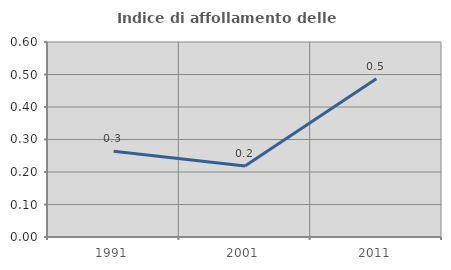
| Category | Indice di affollamento delle abitazioni  |
|---|---|
| 1991.0 | 0.264 |
| 2001.0 | 0.218 |
| 2011.0 | 0.487 |